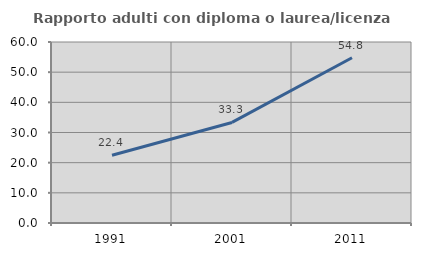
| Category | Rapporto adulti con diploma o laurea/licenza media  |
|---|---|
| 1991.0 | 22.449 |
| 2001.0 | 33.333 |
| 2011.0 | 54.795 |